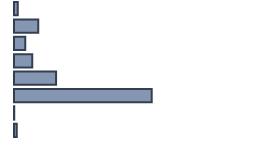
| Category | Percentatge |
|---|---|
| 0 | 1.511 |
| 1 | 10.076 |
| 2 | 4.685 |
| 3 | 7.607 |
| 4 | 17.531 |
| 5 | 57.38 |
| 6 | 0.101 |
| 7 | 1.108 |